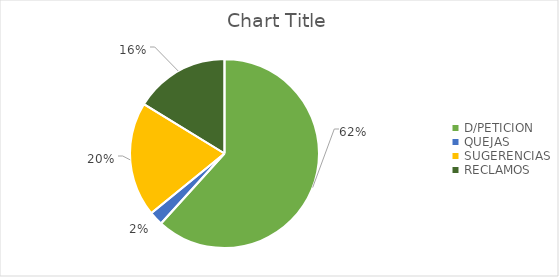
| Category | Series 0 |
|---|---|
| D/PETICION | 129 |
| QUEJAS | 5 |
| SUGERENCIAS | 41 |
| RECLAMOS | 34 |